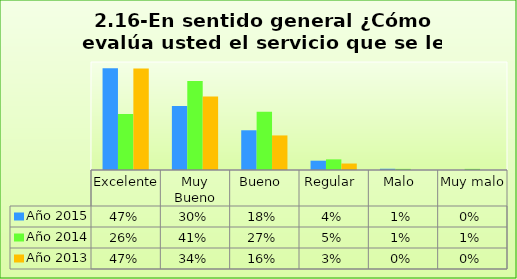
| Category | Año 2015 | Año 2014 | Año 2013 |
|---|---|---|---|
| Excelente | 0.471 | 0.259 | 0.47 |
| Muy Bueno | 0.296 | 0.412 | 0.34 |
| Bueno  | 0.184 | 0.269 | 0.16 |
| Regular  | 0.043 | 0.049 | 0.03 |
| Malo  | 0.006 | 0.005 | 0 |
| Muy malo  | 0 | 0.005 | 0 |